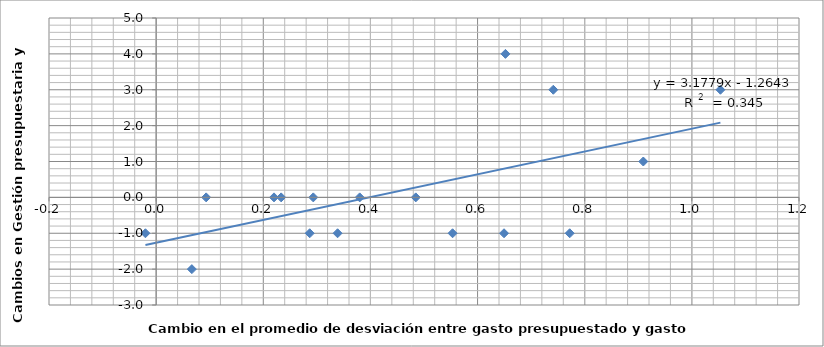
| Category | Cambios |
|---|---|
| 0.29333333333333345 | 0 |
| 0.2333333333333325 | 0 |
| 0.09333333333333371 | 0 |
| 0.06666666666666732 | -2 |
| 0.3386666666666671 | -1 |
| -0.020000000000000018 | -1 |
| 0.7719999999999998 | -1 |
| 0.48466666666666747 | 0 |
| 0.7413333333333336 | 3 |
| 0.9093333333333329 | 1 |
| 1.0533333333333332 | 3 |
| 0.6520000000000001 | 4 |
| 0.2866666666666666 | -1 |
| 0.2200000000000002 | 0 |
| 0.37999999999999945 | 0 |
| 0.6493333333333324 | -1 |
| 0.5533333333333332 | -1 |